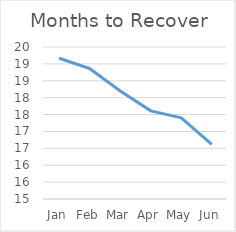
| Category | Months to Recover CAC |
|---|---|
| Jan | 19.168 |
| Feb | 18.858 |
| Mar | 18.195 |
| Apr | 17.609 |
| May | 17.403 |
| Jun | 16.618 |